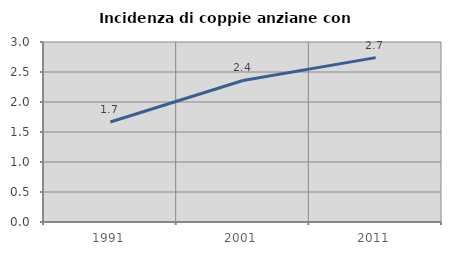
| Category | Incidenza di coppie anziane con figli |
|---|---|
| 1991.0 | 1.667 |
| 2001.0 | 2.358 |
| 2011.0 | 2.74 |